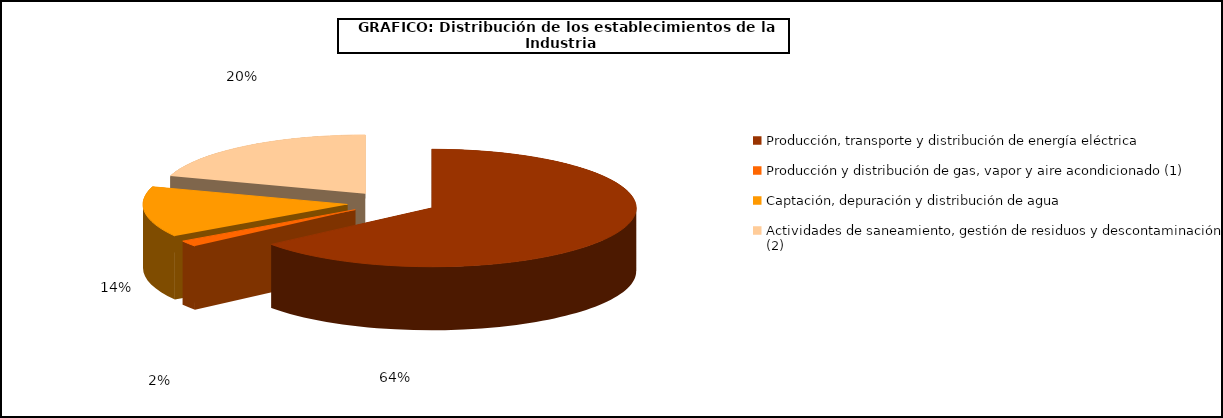
| Category | Series 0 |
|---|---|
| Producción, transporte y distribución de energía eléctrica | 17096 |
| Producción y distribución de gas, vapor y aire acondicionado (1) | 436 |
| Captación, depuración y distribución de agua | 3687 |
| Actividades de saneamiento, gestión de residuos y descontaminación (2) | 5349 |